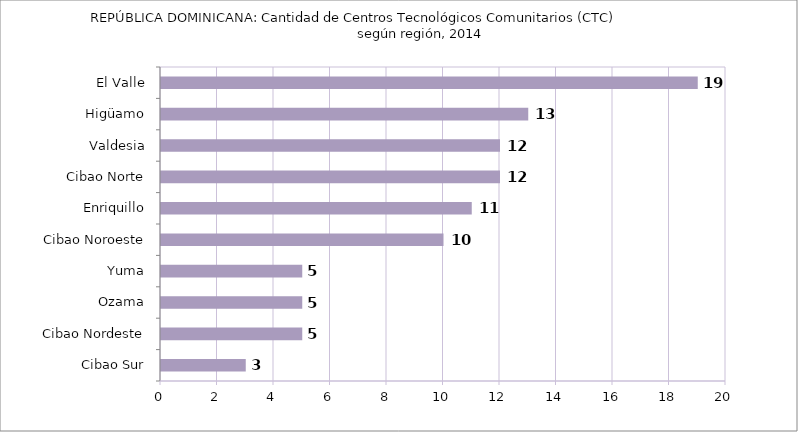
| Category | REPÚBLICA DOMINICANA: Cantidad de Centros Tecnológicos Comunitarios (CTC) según región, 2014  |
|---|---|
| Cibao Sur | 3 |
| Cibao Nordeste | 5 |
| Ozama | 5 |
| Yuma | 5 |
| Cibao Noroeste | 10 |
| Enriquillo | 11 |
| Cibao Norte | 12 |
| Valdesia | 12 |
| Higüamo | 13 |
| El Valle | 19 |